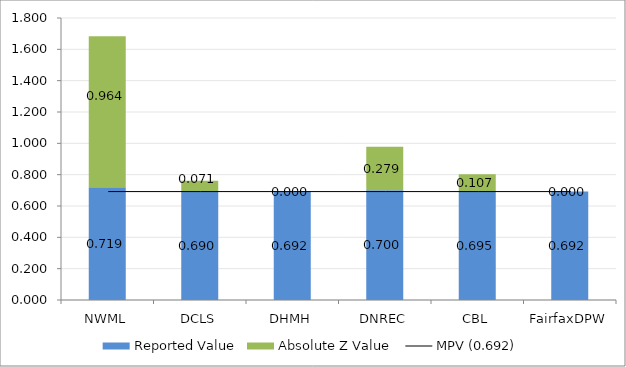
| Category | Reported Value | Absolute Z Value  |
|---|---|---|
| NWML | 0.719 | 0.964 |
| DCLS | 0.69 | 0.071 |
| DHMH | 0.692 | 0 |
| DNREC | 0.7 | 0.279 |
| CBL | 0.695 | 0.107 |
| FairfaxDPW | 0.692 | 0 |